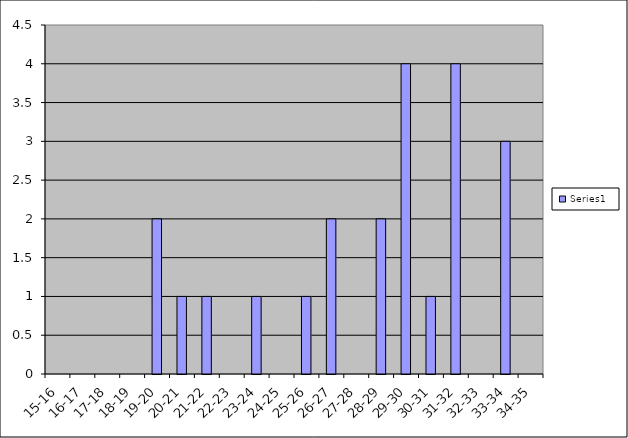
| Category | Series 0 |
|---|---|
| 15-16 | 0 |
| 16-17 | 0 |
| 17-18 | 0 |
| 18-19 | 0 |
| 19-20 | 2 |
| 20-21 | 1 |
| 21-22 | 1 |
| 22-23 | 0 |
| 23-24 | 1 |
| 24-25 | 0 |
| 25-26 | 1 |
| 26-27 | 2 |
| 27-28 | 0 |
| 28-29 | 2 |
| 29-30 | 4 |
| 30-31 | 1 |
| 31-32 | 4 |
| 32-33 | 0 |
| 33-34 | 3 |
| 34-35 | 0 |